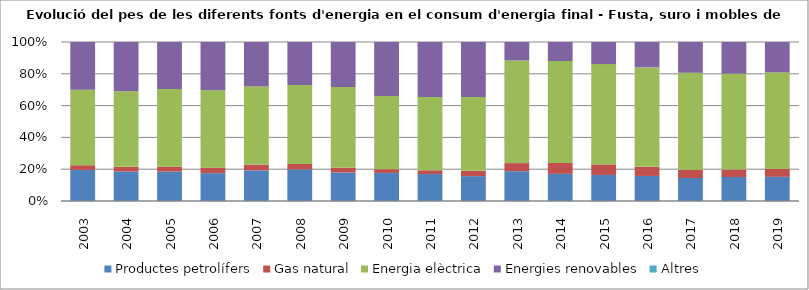
| Category | Productes petrolífers | Gas natural | Energia elèctrica | Energies renovables | Altres |
|---|---|---|---|---|---|
| 2003.0 | 8.6 | 1.3 | 20.89 | 13.2 | 0 |
| 2004.0 | 8.35 | 1.35 | 21.42 | 13.93 | 0 |
| 2005.0 | 8.16 | 1.36 | 21.56 | 13.03 | 0 |
| 2006.0 | 7.83 | 1.54 | 21.79 | 13.54 | 0 |
| 2007.0 | 8.55 | 1.61 | 21.77 | 12.42 | 0 |
| 2008.0 | 7.98 | 1.38 | 19.9 | 10.86 | 0 |
| 2009.0 | 5.72 | 0.99 | 16.17 | 9.05 | 0 |
| 2010.0 | 6.27 | 0.84 | 16.32 | 12.04 | 0 |
| 2011.0 | 5.71 | 0.8 | 15.53 | 11.65 | 0 |
| 2012.0 | 4.75 | 1.01 | 14.11 | 10.5 | 0 |
| 2013.0 | 3.12 | 0.85 | 10.75 | 1.94 | 0 |
| 2014.0 | 2.91 | 1.17 | 10.91 | 2.04 | 0 |
| 2015.0 | 2.94 | 1.19 | 11.31 | 2.49 | 0 |
| 2016.0 | 2.92 | 1.07 | 11.58 | 2.96 | 0 |
| 2017.0 | 2.79 | 0.98 | 11.8 | 3.74 | 0 |
| 2018.0 | 3.02 | 0.94 | 12.07 | 3.98 | 0 |
| 2019.0 | 3.01 | 0.99 | 12.02 | 3.78 | 0 |